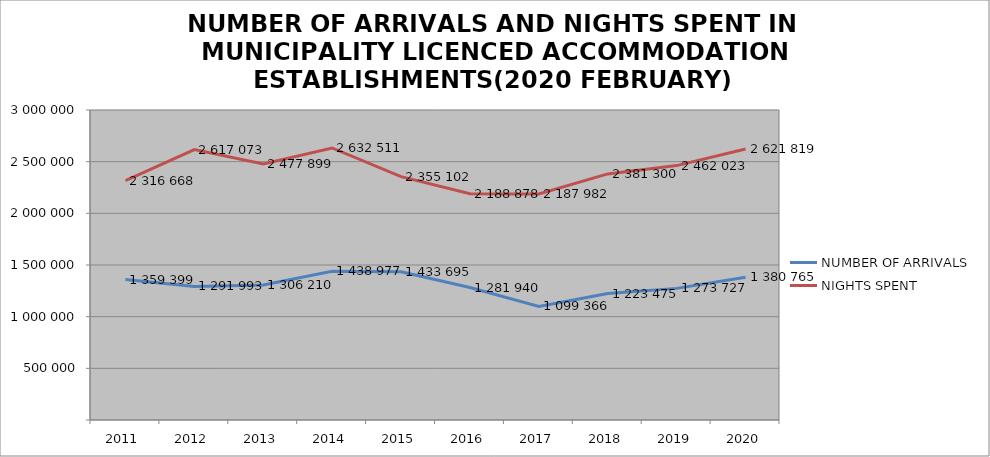
| Category | NUMBER OF ARRIVALS | NIGHTS SPENT |
|---|---|---|
| 2011 | 1359399 | 2316668 |
| 2012 | 1291993 | 2617073 |
| 2013 | 1306210 | 2477899 |
| 2014 | 1438977 | 2632511 |
| 2015 | 1433695 | 2355102 |
| 2016 | 1281940 | 2188878 |
| 2017 | 1099366 | 2187982 |
| 2018 | 1223475 | 2381300 |
| 2019 | 1273727 | 2462023 |
| 2020 | 1380765 | 2621819 |